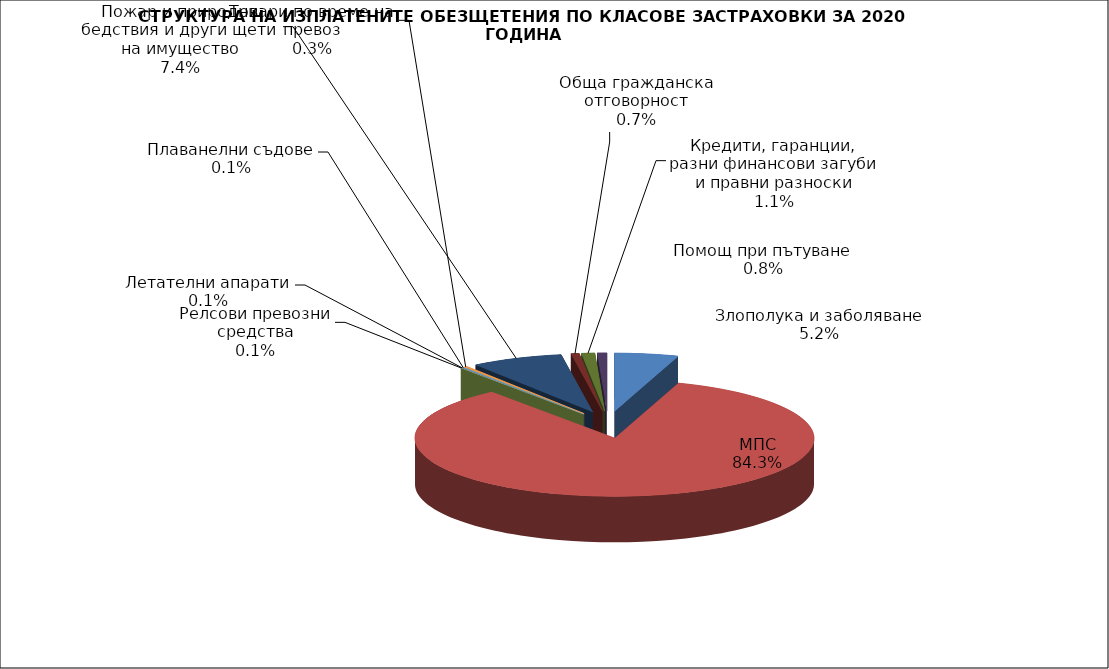
| Category | Злополука и заболяване |
|---|---|
| Злополука и заболяване | 0.052 |
| МПС | 0.843 |
| Релсови превозни средства | 0.001 |
| Летателни апарати | 0.001 |
| Плаванелни съдове | 0.001 |
| Товари по време на превоз | 0.003 |
| Пожар и природни бедствия и други щети на имущество | 0.074 |
| Обща гражданска отговорност | 0.007 |
| Кредити, гаранции, разни финансови загуби и правни разноски | 0.011 |
| Помощ при пътуване | 0.008 |